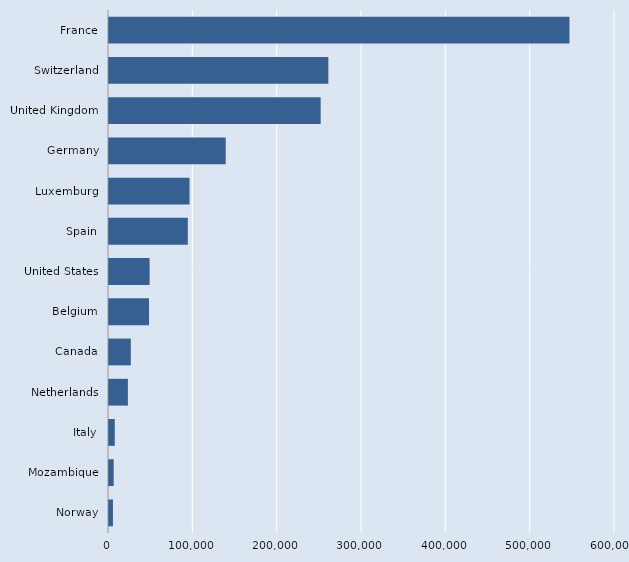
| Category | Series 0 |
|---|---|
| Norway | 4699 |
| Mozambique | 5560 |
| Italy | 6845 |
| Netherlands | 22398 |
| Canada | 25855 |
| Belgium | 47465 |
| United States | 48158 |
| Spain | 93440 |
| Luxemburg | 95500 |
| Germany | 138410 |
| United Kingdom | 251000 |
| Switzerland | 260100 |
| France | 546000 |